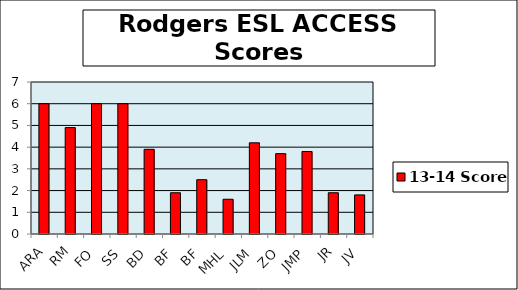
| Category | 13-14 Score |
|---|---|
| ARA | 6 |
| RM | 4.9 |
| FO | 6 |
| SS | 6 |
| BD | 3.9 |
| BF | 1.9 |
| BF | 2.5 |
| MHL | 1.6 |
| JLM | 4.2 |
| ZO | 3.7 |
| JMP | 3.8 |
| JR | 1.9 |
| JV | 1.8 |